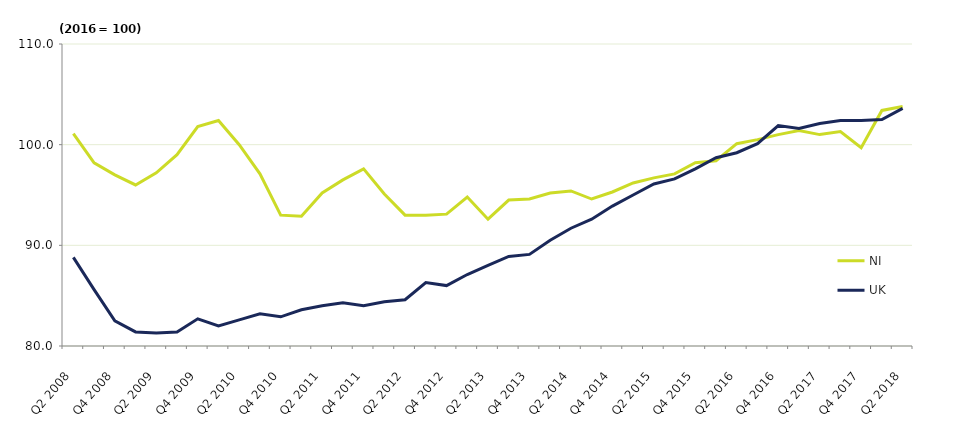
| Category | NI | UK |
|---|---|---|
| Q2 2008 | 101.1 | 88.8 |
| Q3 2008 | 98.2 | 85.6 |
| Q4 2008 | 97 | 82.5 |
| Q1 2009 | 96 | 81.4 |
| Q2 2009 | 97.2 | 81.3 |
| Q3 2009 | 99 | 81.4 |
| Q4 2009 | 101.8 | 82.7 |
| Q1 2010 | 102.4 | 82 |
| Q2 2010 | 100 | 82.6 |
| Q3 2010 | 97.1 | 83.2 |
| Q4 2010 | 93 | 82.9 |
| Q1 2011 | 92.9 | 83.6 |
| Q2 2011 | 95.2 | 84 |
| Q3 2011 | 96.5 | 84.3 |
| Q4 2011 | 97.6 | 84 |
| Q1 2012 | 95.1 | 84.4 |
| Q2 2012 | 93 | 84.6 |
| Q3 2012 | 93 | 86.3 |
| Q4 2012 | 93.1 | 86 |
| Q1 2013 | 94.8 | 87.1 |
| Q2 2013 | 92.6 | 88 |
| Q3 2013 | 94.5 | 88.9 |
| Q4 2013 | 94.6 | 89.1 |
| Q1 2014 | 95.2 | 90.5 |
| Q2 2014 | 95.4 | 91.7 |
| Q3 2014 | 94.6 | 92.6 |
| Q4 2014 | 95.3 | 93.9 |
| Q1 2015 | 96.2 | 95 |
| Q2 2015 | 96.7 | 96.1 |
| Q3 2015 | 97.1 | 96.6 |
| Q4 2015 | 98.2 | 97.6 |
| Q1 2016 | 98.4 | 98.7 |
| Q2 2016 | 100.1 | 99.2 |
| Q3 2016 | 100.5 | 100.1 |
| Q4 2016 | 101 | 101.9 |
| Q1 2017 | 101.4 | 101.6 |
| Q2 2017 | 101 | 102.1 |
| Q3 2017 | 101.3 | 102.4 |
| Q4 2017 | 99.7 | 102.4 |
| Q1 2018 | 103.4 | 102.5 |
| Q2 2018 | 103.8 | 103.6 |